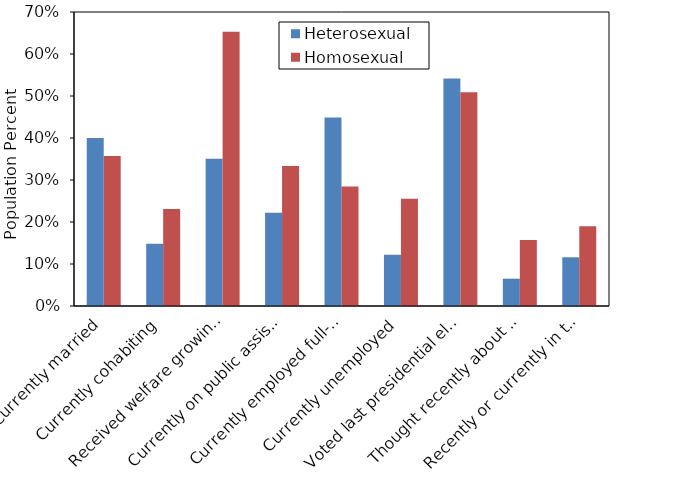
| Category | Heterosexual | Homosexual |
|---|---|---|
| Currently married | 0.4 | 0.357 |
| Currently cohabiting | 0.148 | 0.231 |
| Received welfare growing up | 0.351 | 0.653 |
| Currently on public assistance | 0.222 | 0.334 |
| Currently employed full-time | 0.449 | 0.285 |
| Currently unemployed | 0.122 | 0.255 |
| Voted last presidential election | 0.542 | 0.509 |
| Thought recently about suicide | 0.065 | 0.157 |
| Recently or currently in therapy | 0.116 | 0.19 |